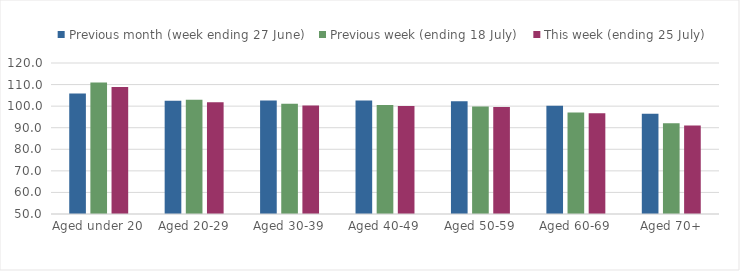
| Category | Previous month (week ending 27 June) | Previous week (ending 18 July) | This week (ending 25 July) |
|---|---|---|---|
| Aged under 20 | 105.907 | 111.016 | 108.861 |
| Aged 20-29 | 102.479 | 102.991 | 101.77 |
| Aged 30-39 | 102.674 | 101.113 | 100.291 |
| Aged 40-49 | 102.587 | 100.527 | 100.083 |
| Aged 50-59 | 102.278 | 99.876 | 99.584 |
| Aged 60-69 | 100.173 | 97.019 | 96.684 |
| Aged 70+ | 96.433 | 92.021 | 91.068 |